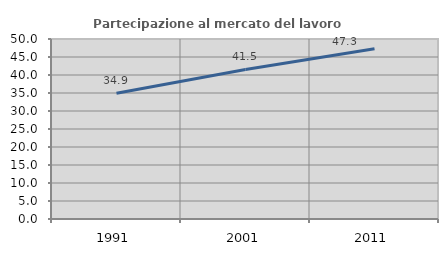
| Category | Partecipazione al mercato del lavoro  femminile |
|---|---|
| 1991.0 | 34.921 |
| 2001.0 | 41.538 |
| 2011.0 | 47.291 |